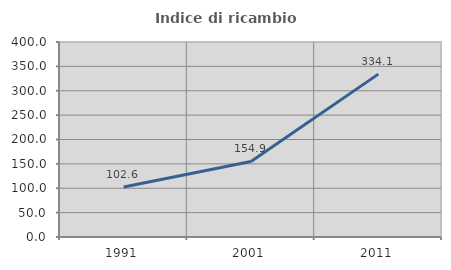
| Category | Indice di ricambio occupazionale  |
|---|---|
| 1991.0 | 102.627 |
| 2001.0 | 154.9 |
| 2011.0 | 334.076 |